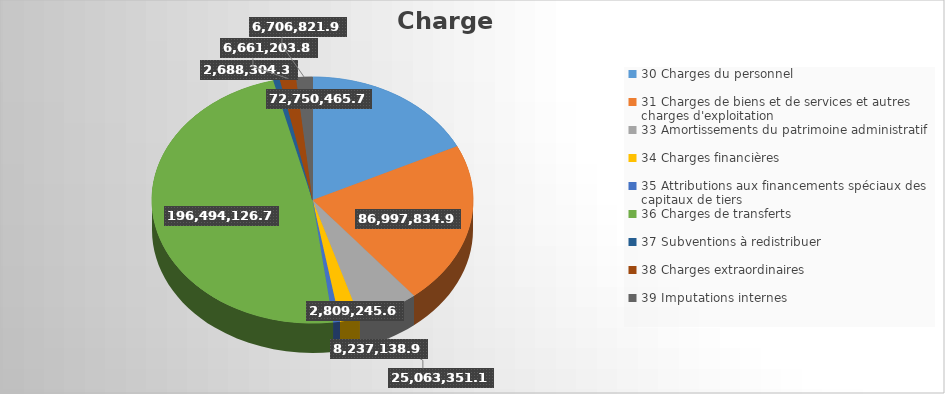
| Category | Series 0 |
|---|---|
| 30 Charges du personnel | 72750465.75 |
| 31 Charges de biens et de services et autres charges d'exploitation | 86997834.98 |
| 33 Amortissements du patrimoine administratif | 25063351.14 |
| 34 Charges financières | 8237138.93 |
| 35 Attributions aux financements spéciaux des capitaux de tiers | 2809245.67 |
| 36 Charges de transferts | 196494126.73 |
| 37 Subventions à redistribuer | 2688304.3 |
| 38 Charges extraordinaires | 6661203.8 |
| 39 Imputations internes | 6706821.9 |